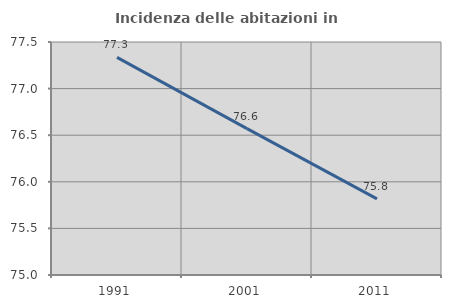
| Category | Incidenza delle abitazioni in proprietà  |
|---|---|
| 1991.0 | 77.335 |
| 2001.0 | 76.571 |
| 2011.0 | 75.817 |